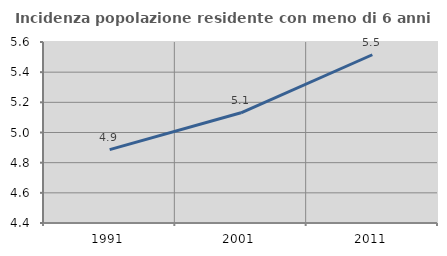
| Category | Incidenza popolazione residente con meno di 6 anni |
|---|---|
| 1991.0 | 4.886 |
| 2001.0 | 5.131 |
| 2011.0 | 5.515 |